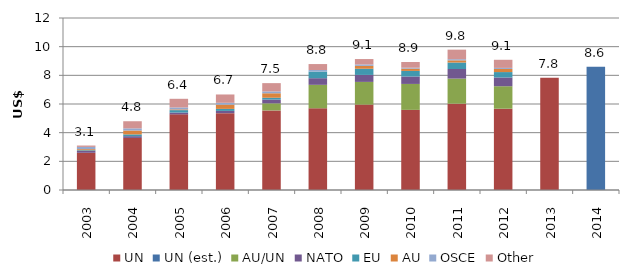
| Category | UN | UN (est.) | AU/UN | NATO | EU | AU | OSCE | Other |
|---|---|---|---|---|---|---|---|---|
| 2003.0 | 2.597 | 0 | 0 | 0.123 | 0.052 | 0.078 | 0.155 | 0.097 |
| 2004.0 | 3.633 | 0 | 0 | 0.123 | 0.124 | 0.27 | 0.151 | 0.497 |
| 2005.0 | 5.277 | 0 | 0 | 0.127 | 0.169 | 0.052 | 0.134 | 0.604 |
| 2006.0 | 5.362 | 0 | 0 | 0.156 | 0.141 | 0.297 | 0.127 | 0.581 |
| 2007.0 | 5.553 | 0 | 0.493 | 0.264 | 0.127 | 0.313 | 0.128 | 0.579 |
| 2008.0 | 5.702 | 0 | 1.635 | 0.463 | 0.46 | 0 | 0.112 | 0.415 |
| 2009.0 | 5.957 | 0 | 1.584 | 0.487 | 0.431 | 0.2 | 0.099 | 0.378 |
| 2010.0 | 5.592 | 0 | 1.808 | 0.519 | 0.389 | 0.16 | 0.064 | 0.4 |
| 2011.0 | 6.024 | 0 | 1.749 | 0.668 | 0.454 | 0.152 | 0.08 | 0.666 |
| 2012.0 | 5.671 | 0 | 1.569 | 0.609 | 0.378 | 0.218 | 0.073 | 0.565 |
| 2013.0 | 7.832 | 0 | 0 | 0 | 0 | 0 | 0 | 0 |
| 2014.0 | 0 | 8.6 | 0 | 0 | 0 | 0 | 0 | 0 |